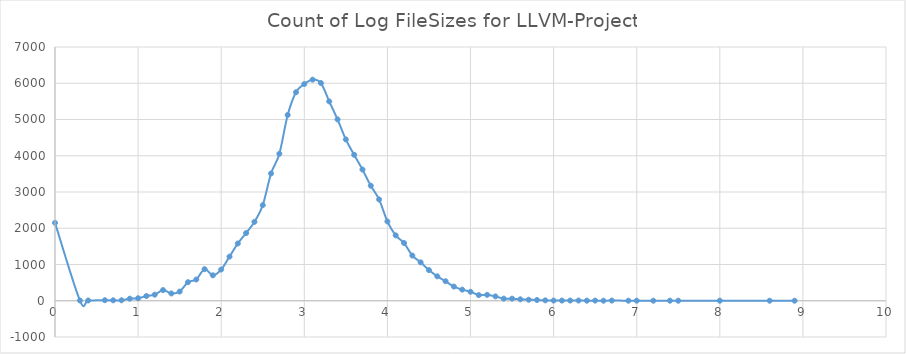
| Category | Count of Log FileSizes for LLVM-Project |
|---|---|
| 0.0 | 2149 |
| 0.3 | 7 |
| 0.4 | 7 |
| 0.6 | 15 |
| 0.7 | 12 |
| 0.8 | 13 |
| 0.9 | 57 |
| 1.0 | 70 |
| 1.1 | 130 |
| 1.2 | 168 |
| 1.3 | 294 |
| 1.4 | 201 |
| 1.5 | 253 |
| 1.6 | 512 |
| 1.7 | 586 |
| 1.8 | 871 |
| 1.9 | 702 |
| 2.0 | 861 |
| 2.1 | 1217 |
| 2.2 | 1580 |
| 2.3 | 1868 |
| 2.4 | 2176 |
| 2.5 | 2636 |
| 2.6 | 3511 |
| 2.7 | 4055 |
| 2.8 | 5124 |
| 2.9 | 5752 |
| 3.0 | 5979 |
| 3.1 | 6099 |
| 3.2 | 6006 |
| 3.3 | 5499 |
| 3.4 | 5002 |
| 3.5 | 4450 |
| 3.6 | 4025 |
| 3.7 | 3620 |
| 3.8 | 3173 |
| 3.9 | 2795 |
| 4.0 | 2188 |
| 4.1 | 1803 |
| 4.2 | 1593 |
| 4.3 | 1247 |
| 4.4 | 1059 |
| 4.5 | 846 |
| 4.6 | 674 |
| 4.7 | 538 |
| 4.8 | 391 |
| 4.9 | 307 |
| 5.0 | 248 |
| 5.1 | 156 |
| 5.2 | 163 |
| 5.3 | 120 |
| 5.4 | 58 |
| 5.5 | 58 |
| 5.6 | 40 |
| 5.7 | 28 |
| 5.8 | 21 |
| 5.9 | 11 |
| 6.0 | 5 |
| 6.1 | 5 |
| 6.2 | 6 |
| 6.3 | 6 |
| 6.4 | 2 |
| 6.5 | 4 |
| 6.6 | 1 |
| 6.7 | 5 |
| 6.9 | 2 |
| 7.0 | 2 |
| 7.2 | 1 |
| 7.4 | 2 |
| 7.5 | 1 |
| 8.0 | 1 |
| 8.6 | 1 |
| 8.9 | 1 |